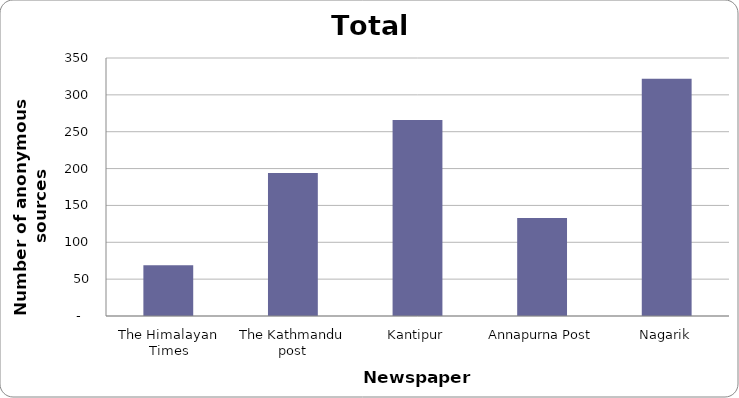
| Category | Series 0 |
|---|---|
| The Himalayan Times | 69 |
| The Kathmandu post | 194 |
| Kantipur | 266 |
| Annapurna Post | 133 |
| Nagarik | 322 |